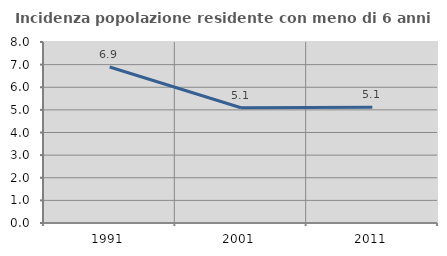
| Category | Incidenza popolazione residente con meno di 6 anni |
|---|---|
| 1991.0 | 6.895 |
| 2001.0 | 5.092 |
| 2011.0 | 5.112 |